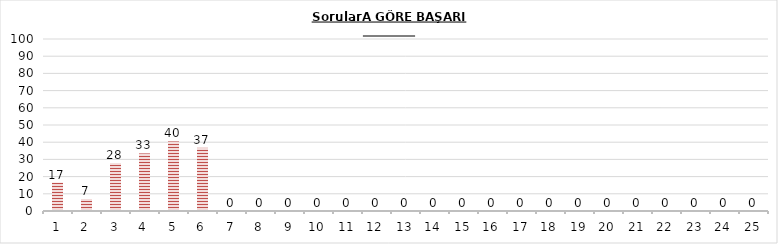
| Category | Series 0 |
|---|---|
| 0 | 16.522 |
| 1 | 6.957 |
| 2 | 27.826 |
| 3 | 33.478 |
| 4 | 40.435 |
| 5 | 36.739 |
| 6 | 0 |
| 7 | 0 |
| 8 | 0 |
| 9 | 0 |
| 10 | 0 |
| 11 | 0 |
| 12 | 0 |
| 13 | 0 |
| 14 | 0 |
| 15 | 0 |
| 16 | 0 |
| 17 | 0 |
| 18 | 0 |
| 19 | 0 |
| 20 | 0 |
| 21 | 0 |
| 22 | 0 |
| 23 | 0 |
| 24 | 0 |